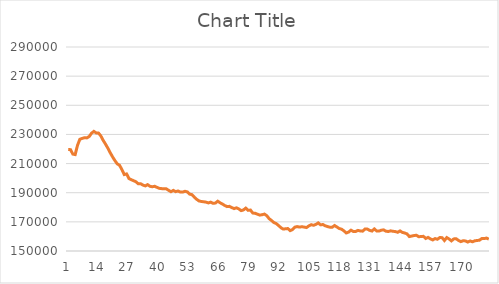
| Category | Series 0 |
|---|---|
| 0 | 219627.51 |
| 1 | 219558.562 |
| 2 | 216484.373 |
| 3 | 216179.38 |
| 4 | 222555.357 |
| 5 | 226675.712 |
| 6 | 227267.18 |
| 7 | 227743.562 |
| 8 | 227613.342 |
| 9 | 228556.892 |
| 10 | 230862.254 |
| 11 | 232103.087 |
| 12 | 231042.397 |
| 13 | 230920.69 |
| 14 | 228895.421 |
| 15 | 225874.748 |
| 16 | 223309.596 |
| 17 | 220513.288 |
| 18 | 217422.243 |
| 19 | 214598.204 |
| 20 | 212046.09 |
| 21 | 209808.917 |
| 22 | 208814.856 |
| 23 | 205868.089 |
| 24 | 202441.784 |
| 25 | 202902.478 |
| 26 | 199748.39 |
| 27 | 198918.224 |
| 28 | 198247.423 |
| 29 | 197505.742 |
| 30 | 196123.88 |
| 31 | 196191.042 |
| 32 | 195241.723 |
| 33 | 194674.55 |
| 34 | 195547.47 |
| 35 | 194412.852 |
| 36 | 194076.839 |
| 37 | 194429.969 |
| 38 | 193667.966 |
| 39 | 193010.091 |
| 40 | 192802.127 |
| 41 | 192715.894 |
| 42 | 192649.064 |
| 43 | 191628.552 |
| 44 | 190685.725 |
| 45 | 191600.125 |
| 46 | 190728.018 |
| 47 | 191183.556 |
| 48 | 190462.862 |
| 49 | 190467.381 |
| 50 | 190979.212 |
| 51 | 190558.068 |
| 52 | 189037.696 |
| 53 | 188661.53 |
| 54 | 186884.579 |
| 55 | 185440.629 |
| 56 | 184347.998 |
| 57 | 183980.437 |
| 58 | 183775.677 |
| 59 | 183535.169 |
| 60 | 182970.972 |
| 61 | 183517.258 |
| 62 | 182732.718 |
| 63 | 182900.465 |
| 64 | 184168.151 |
| 65 | 183102.688 |
| 66 | 182234.055 |
| 67 | 181222.866 |
| 68 | 180460.888 |
| 69 | 180650.434 |
| 70 | 179817.519 |
| 71 | 179087.271 |
| 72 | 179630.998 |
| 73 | 178916.458 |
| 74 | 177718.989 |
| 75 | 178174.918 |
| 76 | 179421.778 |
| 77 | 177909.128 |
| 78 | 178107.915 |
| 79 | 176033.647 |
| 80 | 175896.678 |
| 81 | 175255.101 |
| 82 | 174637.696 |
| 83 | 174890.901 |
| 84 | 175337.254 |
| 85 | 174221.442 |
| 86 | 172206.916 |
| 87 | 170952.237 |
| 88 | 169554.219 |
| 89 | 168833.996 |
| 90 | 167545.908 |
| 91 | 166022.382 |
| 92 | 165052.506 |
| 93 | 165228.836 |
| 94 | 165411.073 |
| 95 | 163982.95 |
| 96 | 164681.168 |
| 97 | 166374.403 |
| 98 | 166759.293 |
| 99 | 166388.021 |
| 100 | 166685.481 |
| 101 | 166409.185 |
| 102 | 166097.023 |
| 103 | 167248.289 |
| 104 | 168051.57 |
| 105 | 167643.204 |
| 106 | 168250.784 |
| 107 | 169275.472 |
| 108 | 167957.488 |
| 109 | 168185.26 |
| 110 | 167271.237 |
| 111 | 166764.809 |
| 112 | 166324.836 |
| 113 | 166359.083 |
| 114 | 167493.792 |
| 115 | 166447.783 |
| 116 | 165428.049 |
| 117 | 164946.187 |
| 118 | 163799.234 |
| 119 | 162383.47 |
| 120 | 162978.225 |
| 121 | 164292.128 |
| 122 | 163415.848 |
| 123 | 163373.718 |
| 124 | 164137.619 |
| 125 | 163756.058 |
| 126 | 163616.597 |
| 127 | 165053.275 |
| 128 | 165064.245 |
| 129 | 164143.459 |
| 130 | 163693.821 |
| 131 | 165163.589 |
| 132 | 163745.697 |
| 133 | 163660.835 |
| 134 | 164281.597 |
| 135 | 164494.572 |
| 136 | 163567.07 |
| 137 | 163398.848 |
| 138 | 163844.77 |
| 139 | 163521.887 |
| 140 | 163350.087 |
| 141 | 162838.377 |
| 142 | 163793.213 |
| 143 | 162754.079 |
| 144 | 162369.996 |
| 145 | 161730.021 |
| 146 | 159903.041 |
| 147 | 160247.669 |
| 148 | 160620.51 |
| 149 | 160792.555 |
| 150 | 159824.174 |
| 151 | 159909.904 |
| 152 | 160084.932 |
| 153 | 158590.197 |
| 154 | 159331.042 |
| 155 | 158334.221 |
| 156 | 157585.886 |
| 157 | 158531.405 |
| 158 | 158044.973 |
| 159 | 159208.162 |
| 160 | 159165.866 |
| 161 | 157196.952 |
| 162 | 159223.827 |
| 163 | 158236.574 |
| 164 | 156948.156 |
| 165 | 158298.474 |
| 166 | 158447.906 |
| 167 | 157258.418 |
| 168 | 156433.605 |
| 169 | 157038.03 |
| 170 | 156909.528 |
| 171 | 156150.355 |
| 172 | 156887.794 |
| 173 | 156325.227 |
| 174 | 156993.803 |
| 175 | 157221.255 |
| 176 | 157414.634 |
| 177 | 158567.554 |
| 178 | 158539.18 |
| 179 | 158859.778 |
| 180 | 158129.543 |